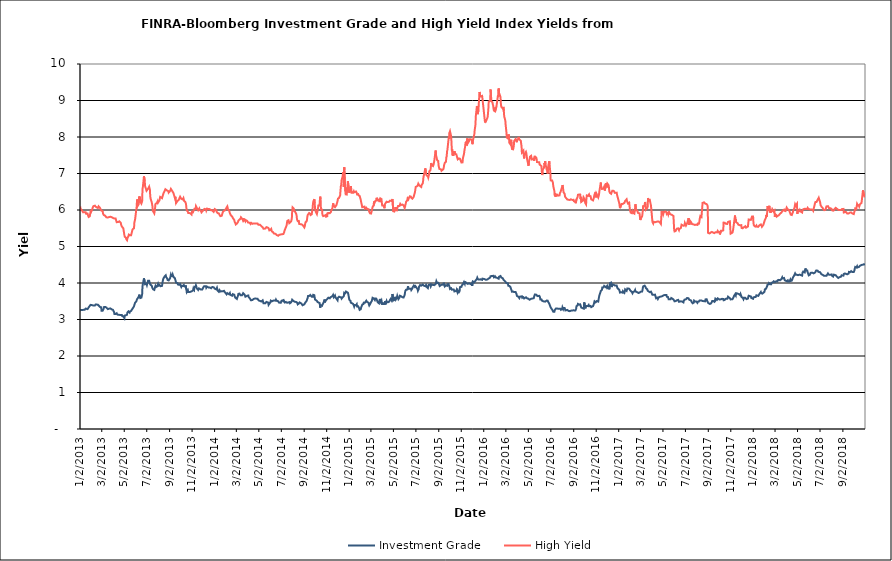
| Category | Investment Grade | High Yield |
|---|---|---|
| 1/2/13 | 3.253 | 6.097 |
| 1/3/13 | 3.262 | 6.031 |
| 1/4/13 | 3.275 | 6.009 |
| 1/7/13 | 3.263 | 5.989 |
| 1/8/13 | 3.254 | 5.982 |
| 1/9/13 | 3.254 | 5.981 |
| 1/10/13 | 3.263 | 5.936 |
| 1/11/13 | 3.269 | 5.922 |
| 1/14/13 | 3.266 | 5.942 |
| 1/15/13 | 3.27 | 5.969 |
| 1/16/13 | 3.27 | 5.969 |
| 1/17/13 | 3.3 | 5.937 |
| 1/18/13 | 3.291 | 5.899 |
| 1/22/13 | 3.284 | 5.903 |
| 1/23/13 | 3.277 | 5.86 |
| 1/24/13 | 3.294 | 5.846 |
| 1/25/13 | 3.332 | 5.809 |
| 1/28/13 | 3.372 | 5.827 |
| 1/29/13 | 3.379 | 5.889 |
| 1/30/13 | 3.401 | 5.942 |
| 1/31/13 | 3.394 | 6.003 |
| 2/1/13 | 3.393 | 5.96 |
| 2/4/13 | 3.392 | 6.024 |
| 2/5/13 | 3.412 | 6.065 |
| 2/6/13 | 3.397 | 6.086 |
| 2/7/13 | 3.382 | 6.107 |
| 2/8/13 | 3.395 | 6.111 |
| 2/11/13 | 3.385 | 6.118 |
| 2/12/13 | 3.399 | 6.096 |
| 2/13/13 | 3.412 | 6.09 |
| 2/14/13 | 3.398 | 6.075 |
| 2/15/13 | 3.402 | 6.08 |
| 2/19/13 | 3.405 | 6.055 |
| 2/20/13 | 3.406 | 6.039 |
| 2/21/13 | 3.382 | 6.101 |
| 2/22/13 | 3.373 | 6.085 |
| 2/25/13 | 3.342 | 6.054 |
| 2/26/13 | 3.328 | 6.07 |
| 2/27/13 | 3.332 | 6.052 |
| 2/28/13 | 3.335 | 5.988 |
| 3/1/13 | 3.239 | 5.98 |
| 3/4/13 | 3.242 | 5.966 |
| 3/5/13 | 3.255 | 5.902 |
| 3/6/13 | 3.279 | 5.894 |
| 3/7/13 | 3.308 | 5.863 |
| 3/8/13 | 3.345 | 5.861 |
| 3/11/13 | 3.345 | 5.841 |
| 3/12/13 | 3.32 | 5.826 |
| 3/13/13 | 3.327 | 5.822 |
| 3/14/13 | 3.328 | 5.799 |
| 3/15/13 | 3.305 | 5.794 |
| 3/18/13 | 3.284 | 5.795 |
| 3/19/13 | 3.26 | 5.788 |
| 3/20/13 | 3.291 | 5.81 |
| 3/21/13 | 3.296 | 5.805 |
| 3/22/13 | 3.302 | 5.8 |
| 3/25/13 | 3.303 | 5.814 |
| 3/26/13 | 3.312 | 5.815 |
| 3/27/13 | 3.283 | 5.806 |
| 3/28/13 | 3.28 | 5.806 |
| 4/1/13 | 3.264 | 5.782 |
| 4/2/13 | 3.274 | 5.776 |
| 4/3/13 | 3.242 | 5.781 |
| 4/4/13 | 3.202 | 5.769 |
| 4/5/13 | 3.149 | 5.775 |
| 4/8/13 | 3.151 | 5.769 |
| 4/9/13 | 3.146 | 5.733 |
| 4/10/13 | 3.17 | 5.712 |
| 4/11/13 | 3.172 | 5.667 |
| 4/12/13 | 3.142 | 5.651 |
| 4/15/13 | 3.128 | 5.669 |
| 4/16/13 | 3.134 | 5.653 |
| 4/17/13 | 3.128 | 5.675 |
| 4/18/13 | 3.127 | 5.689 |
| 4/19/13 | 3.135 | 5.67 |
| 4/22/13 | 3.126 | 5.653 |
| 4/23/13 | 3.117 | 5.6 |
| 4/24/13 | 3.105 | 5.569 |
| 4/25/13 | 3.125 | 5.572 |
| 4/26/13 | 3.092 | 5.534 |
| 4/29/13 | 3.087 | 5.499 |
| 4/30/13 | 3.086 | 5.43 |
| 5/1/13 | 3.067 | 5.368 |
| 5/2/13 | 3.036 | 5.305 |
| 5/3/13 | 3.109 | 5.266 |
| 5/6/13 | 3.117 | 5.244 |
| 5/7/13 | 3.136 | 5.201 |
| 5/8/13 | 3.129 | 5.184 |
| 5/9/13 | 3.131 | 5.173 |
| 5/10/13 | 3.19 | 5.221 |
| 5/13/13 | 3.224 | 5.288 |
| 5/14/13 | 3.228 | 5.326 |
| 5/15/13 | 3.223 | 5.334 |
| 5/16/13 | 3.19 | 5.306 |
| 5/17/13 | 3.218 | 5.305 |
| 5/20/13 | 3.234 | 5.306 |
| 5/21/13 | 3.229 | 5.314 |
| 5/22/13 | 3.258 | 5.327 |
| 5/23/13 | 3.284 | 5.429 |
| 5/24/13 | 3.284 | 5.465 |
| 5/28/13 | 3.36 | 5.504 |
| 5/29/13 | 3.404 | 5.657 |
| 5/30/13 | 3.413 | 5.675 |
| 5/31/13 | 3.463 | 5.748 |
| 6/3/13 | 3.494 | 5.995 |
| 6/4/13 | 3.522 | 6.063 |
| 6/5/13 | 3.552 | 6.239 |
| 6/6/13 | 3.551 | 6.291 |
| 6/7/13 | 3.57 | 6.113 |
| 6/10/13 | 3.628 | 6.164 |
| 6/11/13 | 3.681 | 6.371 |
| 6/12/13 | 3.674 | 6.305 |
| 6/13/13 | 3.66 | 6.359 |
| 6/14/13 | 3.588 | 6.227 |
| 6/17/13 | 3.599 | 6.175 |
| 6/18/13 | 3.646 | 6.192 |
| 6/19/13 | 3.69 | 6.237 |
| 6/20/13 | 3.91 | 6.572 |
| 6/21/13 | 3.967 | 6.634 |
| 6/24/13 | 4.127 | 6.924 |
| 6/25/13 | 4.1 | 6.906 |
| 6/26/13 | 4.034 | 6.807 |
| 6/27/13 | 3.965 | 6.661 |
| 6/28/13 | 3.948 | 6.621 |
| 7/1/13 | 3.98 | 6.527 |
| 7/2/13 | 3.946 | 6.515 |
| 7/3/13 | 3.938 | 6.511 |
| 7/5/13 | 4.063 | 6.58 |
| 7/8/13 | 4.062 | 6.64 |
| 7/9/13 | 4.028 | 6.597 |
| 7/10/13 | 4.031 | 6.565 |
| 7/11/13 | 3.96 | 6.376 |
| 7/12/13 | 3.939 | 6.31 |
| 7/15/13 | 3.925 | 6.216 |
| 7/16/13 | 3.898 | 6.158 |
| 7/17/13 | 3.86 | 6.1 |
| 7/18/13 | 3.855 | 5.979 |
| 7/19/13 | 3.825 | 5.96 |
| 7/22/13 | 3.811 | 5.908 |
| 7/23/13 | 3.816 | 5.902 |
| 7/24/13 | 3.884 | 6.035 |
| 7/25/13 | 3.915 | 6.163 |
| 7/26/13 | 3.885 | 6.171 |
| 7/29/13 | 3.902 | 6.194 |
| 7/30/13 | 3.908 | 6.189 |
| 7/31/13 | 3.941 | 6.239 |
| 8/1/13 | 3.969 | 6.199 |
| 8/2/13 | 3.925 | 6.226 |
| 8/5/13 | 3.944 | 6.265 |
| 8/6/13 | 3.953 | 6.313 |
| 8/7/13 | 3.934 | 6.358 |
| 8/8/13 | 3.913 | 6.344 |
| 8/9/13 | 3.916 | 6.347 |
| 8/12/13 | 3.923 | 6.324 |
| 8/13/13 | 4.006 | 6.362 |
| 8/14/13 | 4.018 | 6.359 |
| 8/15/13 | 4.099 | 6.426 |
| 8/16/13 | 4.129 | 6.46 |
| 8/19/13 | 4.18 | 6.522 |
| 8/20/13 | 4.155 | 6.544 |
| 8/21/13 | 4.183 | 6.569 |
| 8/22/13 | 4.211 | 6.583 |
| 8/23/13 | 4.166 | 6.552 |
| 8/26/13 | 4.123 | 6.531 |
| 8/27/13 | 4.082 | 6.547 |
| 8/28/13 | 4.096 | 6.551 |
| 8/29/13 | 4.092 | 6.517 |
| 8/30/13 | 4.071 | 6.478 |
| 9/3/13 | 4.136 | 6.523 |
| 9/4/13 | 4.142 | 6.53 |
| 9/5/13 | 4.228 | 6.578 |
| 9/6/13 | 4.2 | 6.565 |
| 9/9/13 | 4.187 | 6.515 |
| 9/10/13 | 4.229 | 6.522 |
| 9/11/13 | 4.208 | 6.505 |
| 9/12/13 | 4.17 | 6.461 |
| 9/13/13 | 4.184 | 6.455 |
| 9/16/13 | 4.128 | 6.326 |
| 9/17/13 | 4.134 | 6.364 |
| 9/18/13 | 4.104 | 6.315 |
| 9/19/13 | 4.011 | 6.189 |
| 9/20/13 | 4.008 | 6.188 |
| 9/23/13 | 3.998 | 6.249 |
| 9/24/13 | 3.96 | 6.231 |
| 9/25/13 | 3.94 | 6.257 |
| 9/26/13 | 3.957 | 6.271 |
| 9/27/13 | 3.951 | 6.297 |
| 9/30/13 | 3.97 | 6.364 |
| 10/1/13 | 3.942 | 6.375 |
| 10/2/13 | 3.916 | 6.359 |
| 10/3/13 | 3.897 | 6.31 |
| 10/4/13 | 3.925 | 6.295 |
| 10/7/13 | 3.916 | 6.288 |
| 10/8/13 | 3.924 | 6.308 |
| 10/9/13 | 3.938 | 6.326 |
| 10/10/13 | 3.948 | 6.286 |
| 10/11/13 | 3.91 | 6.244 |
| 10/14/13 | 3.897 | 6.226 |
| 10/15/13 | 3.933 | 6.22 |
| 10/16/13 | 3.91 | 6.161 |
| 10/17/13 | 3.823 | 6.063 |
| 10/18/13 | 3.753 | 5.992 |
| 10/21/13 | 3.801 | 5.954 |
| 10/22/13 | 3.751 | 5.916 |
| 10/23/13 | 3.738 | 5.926 |
| 10/24/13 | 3.757 | 5.93 |
| 10/25/13 | 3.752 | 5.918 |
| 10/28/13 | 3.76 | 5.906 |
| 10/29/13 | 3.759 | 5.89 |
| 10/30/13 | 3.742 | 5.891 |
| 10/31/13 | 3.771 | 5.876 |
| 11/1/13 | 3.795 | 5.951 |
| 11/4/13 | 3.796 | 5.939 |
| 11/5/13 | 3.844 | 5.976 |
| 11/6/13 | 3.827 | 5.962 |
| 11/7/13 | 3.813 | 5.955 |
| 11/8/13 | 3.899 | 6.033 |
| 11/11/13 | 3.894 | 6.024 |
| 11/12/13 | 3.936 | 6.103 |
| 11/13/13 | 3.906 | 6.126 |
| 11/14/13 | 3.856 | 6.076 |
| 11/15/13 | 3.848 | 6.045 |
| 11/18/13 | 3.809 | 5.992 |
| 11/19/13 | 3.825 | 6.008 |
| 11/20/13 | 3.853 | 6.015 |
| 11/21/13 | 3.879 | 6.04 |
| 11/22/13 | 3.847 | 5.999 |
| 11/25/13 | 3.821 | 5.98 |
| 11/26/13 | 3.799 | 5.977 |
| 11/27/13 | 3.816 | 5.936 |
| 11/29/13 | 3.822 | 5.927 |
| 12/2/13 | 3.881 | 5.994 |
| 12/3/13 | 3.869 | 5.992 |
| 12/4/13 | 3.91 | 6.015 |
| 12/5/13 | 3.928 | 6.031 |
| 12/6/13 | 3.927 | 6.016 |
| 12/9/13 | 3.91 | 6.018 |
| 12/10/13 | 3.87 | 5.984 |
| 12/11/13 | 3.872 | 5.997 |
| 12/12/13 | 3.9 | 6.039 |
| 12/13/13 | 3.895 | 6.03 |
| 12/16/13 | 3.878 | 6.026 |
| 12/17/13 | 3.858 | 6.027 |
| 12/18/13 | 3.859 | 6.033 |
| 12/19/13 | 3.878 | 6.024 |
| 12/20/13 | 3.856 | 6.016 |
| 12/23/13 | 3.857 | 5.993 |
| 12/24/13 | 3.875 | 5.996 |
| 12/26/13 | 3.89 | 5.991 |
| 12/27/13 | 3.903 | 5.977 |
| 12/30/13 | 3.883 | 5.95 |
| 12/31/13 | 3.873 | 5.948 |
| 1/2/14 | 3.844 | 6.025 |
| 1/3/14 | 3.842 | 6.009 |
| 1/6/14 | 3.825 | 5.995 |
| 1/7/14 | 3.818 | 5.951 |
| 1/8/14 | 3.87 | 5.943 |
| 1/9/14 | 3.864 | 5.942 |
| 1/10/14 | 3.79 | 5.914 |
| 1/13/14 | 3.762 | 5.905 |
| 1/14/14 | 3.784 | 5.909 |
| 1/15/14 | 3.803 | 5.867 |
| 1/16/14 | 3.78 | 5.861 |
| 1/17/14 | 3.766 | 5.831 |
| 1/21/14 | 3.774 | 5.843 |
| 1/22/14 | 3.801 | 5.829 |
| 1/23/14 | 3.784 | 5.857 |
| 1/24/14 | 3.772 | 5.948 |
| 1/27/14 | 3.786 | 5.982 |
| 1/28/14 | 3.782 | 5.991 |
| 1/29/14 | 3.754 | 6.003 |
| 1/30/14 | 3.748 | 5.991 |
| 1/31/14 | 3.738 | 6.016 |
| 2/3/14 | 3.69 | 6.066 |
| 2/4/14 | 3.699 | 6.082 |
| 2/5/14 | 3.722 | 6.098 |
| 2/6/14 | 3.728 | 6.079 |
| 2/7/14 | 3.695 | 6.015 |
| 2/10/14 | 3.691 | 5.986 |
| 2/11/14 | 3.713 | 5.962 |
| 2/12/14 | 3.724 | 5.911 |
| 2/13/14 | 3.68 | 5.9 |
| 2/14/14 | 3.672 | 5.865 |
| 2/18/14 | 3.652 | 5.821 |
| 2/19/14 | 3.651 | 5.805 |
| 2/20/14 | 3.695 | 5.797 |
| 2/21/14 | 3.681 | 5.767 |
| 2/24/14 | 3.677 | 5.721 |
| 2/25/14 | 3.637 | 5.673 |
| 2/26/14 | 3.618 | 5.653 |
| 2/27/14 | 3.595 | 5.636 |
| 2/28/14 | 3.598 | 5.604 |
| 3/3/14 | 3.563 | 5.628 |
| 3/4/14 | 3.601 | 5.616 |
| 3/5/14 | 3.613 | 5.618 |
| 3/6/14 | 3.649 | 5.671 |
| 3/7/14 | 3.701 | 5.709 |
| 3/10/14 | 3.709 | 5.736 |
| 3/11/14 | 3.709 | 5.734 |
| 3/12/14 | 3.691 | 5.747 |
| 3/13/14 | 3.664 | 5.765 |
| 3/14/14 | 3.655 | 5.799 |
| 3/17/14 | 3.663 | 5.765 |
| 3/18/14 | 3.661 | 5.749 |
| 3/19/14 | 3.675 | 5.728 |
| 3/20/14 | 3.72 | 5.777 |
| 3/21/14 | 3.695 | 5.705 |
| 3/24/14 | 3.678 | 5.735 |
| 3/25/14 | 3.669 | 5.735 |
| 3/26/14 | 3.626 | 5.694 |
| 3/27/14 | 3.629 | 5.724 |
| 3/28/14 | 3.647 | 5.698 |
| 3/31/14 | 3.652 | 5.7 |
| 4/1/14 | 3.641 | 5.714 |
| 4/2/14 | 3.676 | 5.658 |
| 4/3/14 | 3.658 | 5.653 |
| 4/4/14 | 3.612 | 5.634 |
| 4/7/14 | 3.582 | 5.65 |
| 4/8/14 | 3.577 | 5.642 |
| 4/9/14 | 3.572 | 5.618 |
| 4/10/14 | 3.527 | 5.604 |
| 4/11/14 | 3.519 | 5.647 |
| 4/14/14 | 3.533 | 5.622 |
| 4/15/14 | 3.529 | 5.639 |
| 4/16/14 | 3.534 | 5.633 |
| 4/17/14 | 3.562 | 5.633 |
| 4/21/14 | 3.574 | 5.631 |
| 4/22/14 | 3.588 | 5.628 |
| 4/23/14 | 3.564 | 5.628 |
| 4/24/14 | 3.572 | 5.628 |
| 4/25/14 | 3.554 | 5.625 |
| 4/28/14 | 3.568 | 5.63 |
| 4/29/14 | 3.582 | 5.617 |
| 4/30/14 | 3.551 | 5.598 |
| 5/1/14 | 3.522 | 5.612 |
| 5/2/14 | 3.506 | 5.584 |
| 5/5/14 | 3.507 | 5.594 |
| 5/6/14 | 3.51 | 5.583 |
| 5/7/14 | 3.506 | 5.579 |
| 5/8/14 | 3.493 | 5.562 |
| 5/9/14 | 3.498 | 5.534 |
| 5/12/14 | 3.526 | 5.525 |
| 5/13/14 | 3.501 | 5.514 |
| 5/14/14 | 3.446 | 5.488 |
| 5/15/14 | 3.426 | 5.499 |
| 5/16/14 | 3.439 | 5.512 |
| 5/19/14 | 3.443 | 5.491 |
| 5/20/14 | 3.448 | 5.508 |
| 5/21/14 | 3.47 | 5.5 |
| 5/22/14 | 3.482 | 5.53 |
| 5/23/14 | 3.463 | 5.526 |
| 5/27/14 | 3.462 | 5.512 |
| 5/28/14 | 3.401 | 5.487 |
| 5/29/14 | 3.398 | 5.479 |
| 5/30/14 | 3.421 | 5.443 |
| 6/2/14 | 3.475 | 5.453 |
| 6/3/14 | 3.517 | 5.48 |
| 6/4/14 | 3.528 | 5.481 |
| 6/5/14 | 3.519 | 5.441 |
| 6/6/14 | 3.499 | 5.411 |
| 6/9/14 | 3.513 | 5.394 |
| 6/10/14 | 3.532 | 5.381 |
| 6/11/14 | 3.523 | 5.359 |
| 6/12/14 | 3.523 | 5.362 |
| 6/13/14 | 3.519 | 5.366 |
| 6/16/14 | 3.516 | 5.346 |
| 6/17/14 | 3.546 | 5.364 |
| 6/18/14 | 3.533 | 5.363 |
| 6/19/14 | 3.511 | 5.314 |
| 6/20/14 | 3.523 | 5.304 |
| 6/23/14 | 3.501 | 5.294 |
| 6/24/14 | 3.494 | 5.293 |
| 6/25/14 | 3.465 | 5.304 |
| 6/26/14 | 3.453 | 5.321 |
| 6/27/14 | 3.457 | 5.324 |
| 6/30/14 | 3.458 | 5.329 |
| 7/1/14 | 3.475 | 5.317 |
| 7/2/14 | 3.514 | 5.332 |
| 7/3/14 | 3.538 | 5.336 |
| 7/7/14 | 3.53 | 5.343 |
| 7/8/14 | 3.473 | 5.364 |
| 7/9/14 | 3.502 | 5.384 |
| 7/10/14 | 3.481 | 5.427 |
| 7/11/14 | 3.466 | 5.431 |
| 7/14/14 | 3.482 | 5.531 |
| 7/15/14 | 3.497 | 5.553 |
| 7/16/14 | 3.49 | 5.582 |
| 7/17/14 | 3.459 | 5.665 |
| 7/18/14 | 3.469 | 5.704 |
| 7/21/14 | 3.467 | 5.719 |
| 7/22/14 | 3.458 | 5.682 |
| 7/23/14 | 3.443 | 5.641 |
| 7/24/14 | 3.478 | 5.654 |
| 7/25/14 | 3.446 | 5.658 |
| 7/28/14 | 3.469 | 5.688 |
| 7/29/14 | 3.455 | 5.7 |
| 7/30/14 | 3.506 | 5.764 |
| 7/31/14 | 3.543 | 5.968 |
| 8/1/14 | 3.525 | 6.073 |
| 8/4/14 | 3.505 | 6.045 |
| 8/5/14 | 3.517 | 5.981 |
| 8/6/14 | 3.51 | 5.994 |
| 8/7/14 | 3.485 | 5.965 |
| 8/8/14 | 3.464 | 5.953 |
| 8/11/14 | 3.48 | 5.889 |
| 8/12/14 | 3.494 | 5.843 |
| 8/13/14 | 3.476 | 5.746 |
| 8/14/14 | 3.454 | 5.721 |
| 8/15/14 | 3.415 | 5.695 |
| 8/18/14 | 3.436 | 5.699 |
| 8/19/14 | 3.443 | 5.618 |
| 8/20/14 | 3.467 | 5.635 |
| 8/21/14 | 3.456 | 5.605 |
| 8/22/14 | 3.449 | 5.612 |
| 8/25/14 | 3.437 | 5.607 |
| 8/26/14 | 3.427 | 5.585 |
| 8/27/14 | 3.422 | 5.589 |
| 8/28/14 | 3.39 | 5.591 |
| 8/29/14 | 3.388 | 5.58 |
| 9/2/14 | 3.417 | 5.521 |
| 9/3/14 | 3.422 | 5.55 |
| 9/4/14 | 3.455 | 5.611 |
| 9/5/14 | 3.442 | 5.659 |
| 9/8/14 | 3.508 | 5.69 |
| 9/9/14 | 3.502 | 5.725 |
| 9/10/14 | 3.526 | 5.811 |
| 9/11/14 | 3.592 | 5.863 |
| 9/12/14 | 3.644 | 5.879 |
| 9/15/14 | 3.645 | 5.918 |
| 9/16/14 | 3.638 | 5.941 |
| 9/17/14 | 3.642 | 5.916 |
| 9/18/14 | 3.672 | 5.895 |
| 9/19/14 | 3.648 | 5.863 |
| 9/22/14 | 3.624 | 5.882 |
| 9/23/14 | 3.611 | 5.959 |
| 9/24/14 | 3.634 | 6.004 |
| 9/25/14 | 3.622 | 6.133 |
| 9/26/14 | 3.675 | 6.226 |
| 9/29/14 | 3.665 | 6.297 |
| 9/30/14 | 3.666 | 6.198 |
| 10/1/14 | 3.546 | 6.041 |
| 10/2/14 | 3.543 | 6.033 |
| 10/3/14 | 3.562 | 5.951 |
| 10/6/14 | 3.511 | 5.891 |
| 10/7/14 | 3.49 | 5.942 |
| 10/8/14 | 3.476 | 5.966 |
| 10/9/14 | 3.455 | 6.047 |
| 10/10/14 | 3.455 | 6.125 |
| 10/13/14 | 3.455 | 6.126 |
| 10/14/14 | 3.415 | 6.254 |
| 10/15/14 | 3.322 | 6.366 |
| 10/16/14 | 3.392 | 6.295 |
| 10/17/14 | 3.405 | 6.024 |
| 10/20/14 | 3.378 | 6.011 |
| 10/21/14 | 3.408 | 5.869 |
| 10/22/14 | 3.423 | 5.856 |
| 10/23/14 | 3.438 | 5.833 |
| 10/24/14 | 3.46 | 5.826 |
| 10/27/14 | 3.549 | 5.844 |
| 10/28/14 | 3.47 | 5.831 |
| 10/29/14 | 3.508 | 5.854 |
| 10/30/14 | 3.484 | 5.863 |
| 10/31/14 | 3.523 | 5.818 |
| 11/3/14 | 3.563 | 5.828 |
| 11/4/14 | 3.561 | 5.914 |
| 11/5/14 | 3.58 | 5.896 |
| 11/6/14 | 3.597 | 5.904 |
| 11/7/14 | 3.571 | 5.919 |
| 11/10/14 | 3.581 | 5.911 |
| 11/11/14 | 3.58 | 5.894 |
| 11/12/14 | 3.61 | 5.917 |
| 11/13/14 | 3.63 | 5.944 |
| 11/14/14 | 3.622 | 5.986 |
| 11/17/14 | 3.639 | 6.05 |
| 11/18/14 | 3.664 | 6.114 |
| 11/19/14 | 3.676 | 6.183 |
| 11/20/14 | 3.645 | 6.193 |
| 11/21/14 | 3.61 | 6.102 |
| 11/24/14 | 3.655 | 6.077 |
| 11/25/14 | 3.614 | 6.062 |
| 11/26/14 | 3.592 | 6.055 |
| 11/28/14 | 3.571 | 6.136 |
| 12/1/14 | 3.527 | 6.244 |
| 12/2/14 | 3.592 | 6.31 |
| 12/3/14 | 3.6 | 6.3 |
| 12/4/14 | 3.583 | 6.311 |
| 12/5/14 | 3.624 | 6.33 |
| 12/8/14 | 3.613 | 6.401 |
| 12/9/14 | 3.596 | 6.533 |
| 12/10/14 | 3.594 | 6.652 |
| 12/11/14 | 3.607 | 6.697 |
| 12/12/14 | 3.574 | 6.816 |
| 12/15/14 | 3.61 | 6.93 |
| 12/16/14 | 3.622 | 7.031 |
| 12/17/14 | 3.611 | 6.874 |
| 12/18/14 | 3.64 | 6.631 |
| 12/19/14 | 3.733 | 7.172 |
| 12/22/14 | 3.718 | 6.524 |
| 12/23/14 | 3.739 | 6.429 |
| 12/24/14 | 3.766 | 6.426 |
| 12/26/14 | 3.758 | 6.424 |
| 12/29/14 | 3.733 | 6.787 |
| 12/30/14 | 3.701 | 6.803 |
| 12/31/14 | 3.703 | 6.802 |
| 1/2/15 | 3.539 | 6.473 |
| 1/5/15 | 3.512 | 6.579 |
| 1/6/15 | 3.46 | 6.653 |
| 1/7/15 | 3.461 | 6.584 |
| 1/8/15 | 3.475 | 6.473 |
| 1/9/15 | 3.446 | 6.454 |
| 1/12/15 | 3.428 | 6.47 |
| 1/13/15 | 3.418 | 6.483 |
| 1/14/15 | 3.39 | 6.514 |
| 1/15/15 | 3.36 | 6.485 |
| 1/16/15 | 3.398 | 6.499 |
| 1/20/15 | 3.388 | 6.507 |
| 1/21/15 | 3.406 | 6.501 |
| 1/22/15 | 3.418 | 6.465 |
| 1/23/15 | 3.358 | 6.428 |
| 1/26/15 | 3.361 | 6.434 |
| 1/27/15 | 3.345 | 6.403 |
| 1/28/15 | 3.321 | 6.38 |
| 1/29/15 | 3.327 | 6.384 |
| 1/30/15 | 3.263 | 6.383 |
| 2/2/15 | 3.283 | 6.276 |
| 2/3/15 | 3.33 | 6.218 |
| 2/4/15 | 3.356 | 6.175 |
| 2/5/15 | 3.339 | 6.128 |
| 2/6/15 | 3.407 | 6.077 |
| 2/9/15 | 3.421 | 6.086 |
| 2/10/15 | 3.462 | 6.091 |
| 2/11/15 | 3.47 | 6.106 |
| 2/12/15 | 3.453 | 6.094 |
| 2/13/15 | 3.458 | 6.04 |
| 2/17/15 | 3.516 | 6.061 |
| 2/18/15 | 3.496 | 6.032 |
| 2/19/15 | 3.481 | 6.045 |
| 2/20/15 | 3.471 | 6.044 |
| 2/23/15 | 3.46 | 6.021 |
| 2/24/15 | 3.413 | 5.985 |
| 2/25/15 | 3.385 | 5.95 |
| 2/26/15 | 3.409 | 5.923 |
| 2/27/15 | 3.418 | 5.91 |
| 3/2/15 | 3.477 | 5.903 |
| 3/3/15 | 3.496 | 5.943 |
| 3/4/15 | 3.51 | 5.991 |
| 3/5/15 | 3.501 | 6 |
| 3/6/15 | 3.594 | 6.079 |
| 3/9/15 | 3.577 | 6.134 |
| 3/10/15 | 3.55 | 6.235 |
| 3/11/15 | 3.562 | 6.188 |
| 3/12/15 | 3.536 | 6.163 |
| 3/13/15 | 3.575 | 6.241 |
| 3/16/15 | 3.572 | 6.268 |
| 3/17/15 | 3.575 | 6.335 |
| 3/18/15 | 3.525 | 6.323 |
| 3/19/15 | 3.502 | 6.265 |
| 3/20/15 | 3.473 | 6.273 |
| 3/23/15 | 3.447 | 6.285 |
| 3/24/15 | 3.422 | 6.276 |
| 3/25/15 | 3.437 | 6.217 |
| 3/26/15 | 3.564 | 6.235 |
| 3/27/15 | 3.474 | 6.318 |
| 3/30/15 | 3.526 | 6.299 |
| 3/31/15 | 3.507 | 6.274 |
| 4/1/15 | 3.404 | 6.124 |
| 4/2/15 | 3.449 | 6.142 |
| 4/6/15 | 3.44 | 6.113 |
| 4/7/15 | 3.404 | 6.048 |
| 4/8/15 | 3.398 | 6.153 |
| 4/9/15 | 3.501 | 6.166 |
| 4/10/15 | 3.417 | 6.184 |
| 4/13/15 | 3.504 | 6.228 |
| 4/14/15 | 3.471 | 6.226 |
| 4/15/15 | 3.473 | 6.219 |
| 4/16/15 | 3.484 | 6.218 |
| 4/17/15 | 3.473 | 6.234 |
| 4/20/15 | 3.489 | 6.228 |
| 4/21/15 | 3.492 | 6.234 |
| 4/22/15 | 3.533 | 6.256 |
| 4/23/15 | 3.533 | 6.264 |
| 4/24/15 | 3.564 | 6.251 |
| 4/27/15 | 3.515 | 6.246 |
| 4/28/15 | 3.552 | 6.264 |
| 4/29/15 | 3.699 | 6.302 |
| 4/30/15 | 3.726 | 6.285 |
| 5/1/15 | 3.52 | 5.968 |
| 5/4/15 | 3.534 | 5.958 |
| 5/5/15 | 3.574 | 5.972 |
| 5/6/15 | 3.62 | 6.006 |
| 5/7/15 | 3.605 | 6.081 |
| 5/8/15 | 3.55 | 5.995 |
| 5/11/15 | 3.609 | 5.99 |
| 5/12/15 | 3.65 | 6.054 |
| 5/13/15 | 3.637 | 6.048 |
| 5/14/15 | 3.622 | 6.108 |
| 5/15/15 | 3.557 | 6.102 |
| 5/18/15 | 3.6 | 6.112 |
| 5/19/15 | 3.651 | 6.136 |
| 5/20/15 | 3.661 | 6.167 |
| 5/21/15 | 3.638 | 6.158 |
| 5/22/15 | 3.64 | 6.136 |
| 5/26/15 | 3.609 | 6.149 |
| 5/27/15 | 3.605 | 6.158 |
| 5/28/15 | 3.609 | 6.154 |
| 5/29/15 | 3.603 | 6.129 |
| 6/1/15 | 3.671 | 6.055 |
| 6/2/15 | 3.74 | 6.084 |
| 6/3/15 | 3.79 | 6.139 |
| 6/4/15 | 3.77 | 6.173 |
| 6/5/15 | 3.818 | 6.229 |
| 6/8/15 | 3.819 | 6.264 |
| 6/9/15 | 3.86 | 6.317 |
| 6/10/15 | 3.91 | 6.341 |
| 6/11/15 | 3.87 | 6.29 |
| 6/12/15 | 3.84 | 6.32 |
| 6/15/15 | 3.842 | 6.375 |
| 6/16/15 | 3.839 | 6.396 |
| 6/17/15 | 3.856 | 6.39 |
| 6/18/15 | 3.846 | 6.365 |
| 6/19/15 | 3.809 | 6.333 |
| 6/22/15 | 3.854 | 6.31 |
| 6/23/15 | 3.886 | 6.314 |
| 6/24/15 | 3.89 | 6.335 |
| 6/25/15 | 3.906 | 6.351 |
| 6/26/15 | 3.933 | 6.383 |
| 6/29/15 | 3.911 | 6.493 |
| 6/30/15 | 3.862 | 6.48 |
| 7/1/15 | 3.903 | 6.633 |
| 7/2/15 | 3.879 | 6.623 |
| 7/6/15 | 3.834 | 6.661 |
| 7/7/15 | 3.788 | 6.691 |
| 7/8/15 | 3.79 | 6.722 |
| 7/9/15 | 3.833 | 6.699 |
| 7/10/15 | 3.898 | 6.684 |
| 7/13/15 | 3.945 | 6.654 |
| 7/14/15 | 3.962 | 6.658 |
| 7/15/15 | 3.941 | 6.639 |
| 7/16/15 | 3.928 | 6.631 |
| 7/17/15 | 3.92 | 6.684 |
| 7/20/15 | 3.957 | 6.728 |
| 7/21/15 | 3.946 | 6.789 |
| 7/22/15 | 3.931 | 6.902 |
| 7/23/15 | 3.927 | 6.942 |
| 7/24/15 | 3.914 | 6.987 |
| 7/27/15 | 3.912 | 7.142 |
| 7/28/15 | 3.92 | 7.122 |
| 7/29/15 | 3.945 | 7.014 |
| 7/30/15 | 3.937 | 6.955 |
| 7/31/15 | 3.891 | 6.938 |
| 8/3/15 | 3.859 | 6.92 |
| 8/4/15 | 3.885 | 6.888 |
| 8/5/15 | 3.946 | 6.932 |
| 8/6/15 | 3.943 | 6.967 |
| 8/7/15 | 3.927 | 7.062 |
| 8/10/15 | 3.964 | 7.093 |
| 8/11/15 | 3.914 | 7.18 |
| 8/12/15 | 3.922 | 7.288 |
| 8/13/15 | 3.961 | 7.23 |
| 8/14/15 | 3.966 | 7.205 |
| 8/17/15 | 3.946 | 7.205 |
| 8/18/15 | 3.964 | 7.21 |
| 8/19/15 | 3.97 | 7.268 |
| 8/20/15 | 3.942 | 7.329 |
| 8/21/15 | 3.932 | 7.397 |
| 8/24/15 | 3.969 | 7.631 |
| 8/25/15 | 4.004 | 7.506 |
| 8/26/15 | 4.048 | 7.509 |
| 8/27/15 | 4.024 | 7.42 |
| 8/28/15 | 3.999 | 7.369 |
| 8/31/15 | 4.006 | 7.34 |
| 9/1/15 | 3.984 | 7.221 |
| 9/2/15 | 3.974 | 7.211 |
| 9/3/15 | 3.949 | 7.128 |
| 9/4/15 | 3.918 | 7.154 |
| 9/8/15 | 3.947 | 7.11 |
| 9/9/15 | 3.956 | 7.075 |
| 9/10/15 | 3.97 | 7.101 |
| 9/11/15 | 3.954 | 7.087 |
| 9/14/15 | 3.96 | 7.121 |
| 9/15/15 | 4.007 | 7.156 |
| 9/16/15 | 4.028 | 7.23 |
| 9/17/15 | 3.993 | 7.256 |
| 9/18/15 | 3.906 | 7.296 |
| 9/21/15 | 3.934 | 7.32 |
| 9/22/15 | 3.908 | 7.44 |
| 9/23/15 | 3.928 | 7.47 |
| 9/24/15 | 3.924 | 7.602 |
| 9/25/15 | 3.968 | 7.65 |
| 9/28/15 | 3.972 | 7.936 |
| 9/29/15 | 3.972 | 8.01 |
| 9/30/15 | 3.965 | 7.959 |
| 10/1/15 | 3.884 | 8.129 |
| 10/2/15 | 3.839 | 8.158 |
| 10/5/15 | 3.857 | 8.024 |
| 10/6/15 | 3.84 | 7.851 |
| 10/7/15 | 3.818 | 7.629 |
| 10/8/15 | 3.812 | 7.659 |
| 10/9/15 | 3.837 | 7.508 |
| 10/12/15 | 3.824 | 7.508 |
| 10/13/15 | 3.812 | 7.563 |
| 10/14/15 | 3.768 | 7.61 |
| 10/15/15 | 3.779 | 7.616 |
| 10/16/15 | 3.788 | 7.538 |
| 10/19/15 | 3.785 | 7.528 |
| 10/20/15 | 3.814 | 7.497 |
| 10/21/15 | 3.788 | 7.455 |
| 10/22/15 | 3.753 | 7.473 |
| 10/23/15 | 3.796 | 7.388 |
| 10/26/15 | 3.747 | 7.413 |
| 10/27/15 | 3.743 | 7.438 |
| 10/28/15 | 3.777 | 7.418 |
| 10/29/15 | 3.886 | 7.404 |
| 10/30/15 | 3.896 | 7.394 |
| 11/2/15 | 3.894 | 7.301 |
| 11/3/15 | 3.935 | 7.298 |
| 11/4/15 | 3.959 | 7.279 |
| 11/5/15 | 3.956 | 7.305 |
| 11/6/15 | 3.965 | 7.419 |
| 11/9/15 | 4.026 | 7.539 |
| 11/10/15 | 4.023 | 7.622 |
| 11/11/15 | 3.98 | 7.598 |
| 11/12/15 | 4.043 | 7.738 |
| 11/13/15 | 4.012 | 7.843 |
| 11/16/15 | 3.995 | 7.878 |
| 11/17/15 | 4.004 | 7.77 |
| 11/18/15 | 4.007 | 7.96 |
| 11/19/15 | 3.976 | 7.826 |
| 11/20/15 | 3.983 | 7.817 |
| 11/23/15 | 3.992 | 7.892 |
| 11/24/15 | 3.987 | 7.94 |
| 11/25/15 | 3.985 | 7.947 |
| 11/27/15 | 3.969 | 7.941 |
| 11/30/15 | 3.988 | 7.921 |
| 12/1/15 | 3.922 | 7.843 |
| 12/2/15 | 3.941 | 7.803 |
| 12/3/15 | 4.042 | 7.88 |
| 12/4/15 | 4.027 | 7.946 |
| 12/7/15 | 4.02 | 8.079 |
| 12/8/15 | 4.022 | 8.196 |
| 12/9/15 | 4.049 | 8.261 |
| 12/10/15 | 4.07 | 8.336 |
| 12/11/15 | 4.029 | 8.573 |
| 12/14/15 | 4.113 | 8.851 |
| 12/15/15 | 4.144 | 8.708 |
| 12/16/15 | 4.149 | 8.625 |
| 12/17/15 | 4.1 | 8.603 |
| 12/18/15 | 4.089 | 8.721 |
| 12/21/15 | 4.094 | 9.233 |
| 12/22/15 | 4.106 | 9.187 |
| 12/23/15 | 4.112 | 9.11 |
| 12/24/15 | 4.101 | 9.094 |
| 12/28/15 | 4.087 | 9.127 |
| 12/29/15 | 4.12 | 9.054 |
| 12/30/15 | 4.125 | 9.036 |
| 12/31/15 | 4.104 | 9.06 |
| 1/4/16 | 4.106 | 8.484 |
| 1/5/16 | 4.12 | 8.399 |
| 1/6/16 | 4.084 | 8.412 |
| 1/7/16 | 4.09 | 8.486 |
| 1/8/16 | 4.067 | 8.446 |
| 1/11/16 | 4.093 | 8.512 |
| 1/12/16 | 4.085 | 8.549 |
| 1/13/16 | 4.082 | 8.64 |
| 1/14/16 | 4.118 | 8.769 |
| 1/15/16 | 4.122 | 8.973 |
| 1/19/16 | 4.149 | 8.988 |
| 1/20/16 | 4.186 | 9.301 |
| 1/21/16 | 4.177 | 9.211 |
| 1/22/16 | 4.196 | 8.98 |
| 1/25/16 | 4.194 | 8.955 |
| 1/26/16 | 4.187 | 8.894 |
| 1/27/16 | 4.214 | 8.863 |
| 1/28/16 | 4.196 | 8.783 |
| 1/29/16 | 4.16 | 8.725 |
| 2/1/16 | 4.182 | 8.703 |
| 2/2/16 | 4.154 | 8.78 |
| 2/3/16 | 4.156 | 8.825 |
| 2/4/16 | 4.15 | 8.793 |
| 2/5/16 | 4.151 | 8.837 |
| 2/8/16 | 4.131 | 9.058 |
| 2/9/16 | 4.149 | 9.143 |
| 2/10/16 | 4.131 | 9.094 |
| 2/11/16 | 4.116 | 9.329 |
| 2/12/16 | 4.171 | 9.21 |
| 2/16/16 | 4.192 | 9.095 |
| 2/17/16 | 4.208 | 8.915 |
| 2/18/16 | 4.15 | 8.831 |
| 2/19/16 | 4.138 | 8.84 |
| 2/22/16 | 4.13 | 8.781 |
| 2/23/16 | 4.106 | 8.783 |
| 2/24/16 | 4.09 | 8.824 |
| 2/25/16 | 4.064 | 8.702 |
| 2/26/16 | 4.072 | 8.564 |
| 2/29/16 | 4.042 | 8.449 |
| 3/1/16 | 4.025 | 8.321 |
| 3/2/16 | 4.029 | 8.227 |
| 3/3/16 | 3.997 | 8.131 |
| 3/4/16 | 4.002 | 7.988 |
| 3/7/16 | 3.992 | 7.96 |
| 3/8/16 | 3.928 | 8.028 |
| 3/9/16 | 3.943 | 8.071 |
| 3/10/16 | 3.949 | 8.015 |
| 3/11/16 | 3.918 | 7.839 |
| 3/14/16 | 3.887 | 7.796 |
| 3/15/16 | 3.911 | 7.883 |
| 3/16/16 | 3.862 | 7.924 |
| 3/17/16 | 3.796 | 7.778 |
| 3/18/16 | 3.762 | 7.673 |
| 3/21/16 | 3.765 | 7.661 |
| 3/22/16 | 3.763 | 7.696 |
| 3/23/16 | 3.743 | 7.751 |
| 3/24/16 | 3.75 | 7.891 |
| 3/28/16 | 3.751 | 7.945 |
| 3/29/16 | 3.724 | 7.962 |
| 3/30/16 | 3.707 | 7.915 |
| 3/31/16 | 3.668 | 7.857 |
| 4/1/16 | 3.64 | 7.924 |
| 4/4/16 | 3.626 | 7.932 |
| 4/5/16 | 3.6 | 8.003 |
| 4/6/16 | 3.616 | 7.948 |
| 4/7/16 | 3.587 | 7.964 |
| 4/8/16 | 3.623 | 7.931 |
| 4/11/16 | 3.629 | 7.898 |
| 4/12/16 | 3.648 | 7.816 |
| 4/13/16 | 3.636 | 7.75 |
| 4/14/16 | 3.636 | 7.578 |
| 4/15/16 | 3.596 | 7.599 |
| 4/18/16 | 3.611 | 7.627 |
| 4/19/16 | 3.584 | 7.493 |
| 4/20/16 | 3.577 | 7.413 |
| 4/21/16 | 3.601 | 7.525 |
| 4/22/16 | 3.602 | 7.509 |
| 4/25/16 | 3.608 | 7.592 |
| 4/26/16 | 3.633 | 7.556 |
| 4/27/16 | 3.611 | 7.481 |
| 4/28/16 | 3.58 | 7.395 |
| 4/29/16 | 3.567 | 7.393 |
| 5/2/16 | 3.567 | 7.211 |
| 5/3/16 | 3.545 | 7.322 |
| 5/4/16 | 3.56 | 7.364 |
| 5/5/16 | 3.542 | 7.403 |
| 5/6/16 | 3.562 | 7.461 |
| 5/9/16 | 3.568 | 7.485 |
| 5/10/16 | 3.562 | 7.463 |
| 5/11/16 | 3.554 | 7.385 |
| 5/12/16 | 3.575 | 7.4 |
| 5/13/16 | 3.564 | 7.402 |
| 5/16/16 | 3.583 | 7.399 |
| 5/17/16 | 3.587 | 7.35 |
| 5/18/16 | 3.653 | 7.369 |
| 5/19/16 | 3.683 | 7.483 |
| 5/20/16 | 3.682 | 7.418 |
| 5/23/16 | 3.68 | 7.433 |
| 5/24/16 | 3.695 | 7.39 |
| 5/25/16 | 3.68 | 7.313 |
| 5/26/16 | 3.641 | 7.301 |
| 5/27/16 | 3.632 | 7.293 |
| 5/31/16 | 3.649 | 7.308 |
| 6/1/16 | 3.638 | 7.247 |
| 6/2/16 | 3.613 | 7.269 |
| 6/3/16 | 3.549 | 7.242 |
| 6/6/16 | 3.55 | 7.2 |
| 6/7/16 | 3.53 | 7.058 |
| 6/8/16 | 3.512 | 6.957 |
| 6/9/16 | 3.494 | 7.046 |
| 6/10/16 | 3.491 | 7.112 |
| 6/13/16 | 3.493 | 7.16 |
| 6/14/16 | 3.513 | 7.288 |
| 6/15/16 | 3.501 | 7.256 |
| 6/16/16 | 3.489 | 7.342 |
| 6/17/16 | 3.503 | 7.262 |
| 6/20/16 | 3.518 | 7.114 |
| 6/21/16 | 3.523 | 7.133 |
| 6/22/16 | 3.512 | 7.061 |
| 6/23/16 | 3.517 | 7 |
| 6/24/16 | 3.486 | 7.176 |
| 6/27/16 | 3.438 | 7.337 |
| 6/28/16 | 3.412 | 7.263 |
| 6/29/16 | 3.384 | 7.135 |
| 6/30/16 | 3.381 | 7.047 |
| 7/1/16 | 3.331 | 6.811 |
| 7/5/16 | 3.272 | 6.808 |
| 7/6/16 | 3.262 | 6.83 |
| 7/7/16 | 3.248 | 6.752 |
| 7/8/16 | 3.215 | 6.66 |
| 7/11/16 | 3.215 | 6.521 |
| 7/12/16 | 3.256 | 6.4 |
| 7/13/16 | 3.231 | 6.458 |
| 7/14/16 | 3.264 | 6.364 |
| 7/15/16 | 3.299 | 6.415 |
| 7/18/16 | 3.303 | 6.424 |
| 7/19/16 | 3.289 | 6.431 |
| 7/20/16 | 3.3 | 6.411 |
| 7/21/16 | 3.295 | 6.394 |
| 7/22/16 | 3.282 | 6.4 |
| 7/25/16 | 3.297 | 6.401 |
| 7/26/16 | 3.318 | 6.458 |
| 7/27/16 | 3.3 | 6.461 |
| 7/28/16 | 3.296 | 6.496 |
| 7/29/16 | 3.266 | 6.535 |
| 8/1/16 | 3.285 | 6.628 |
| 8/2/16 | 3.334 | 6.681 |
| 8/3/16 | 3.338 | 6.65 |
| 8/4/16 | 3.284 | 6.56 |
| 8/5/16 | 3.315 | 6.486 |
| 8/8/16 | 3.313 | 6.441 |
| 8/9/16 | 3.287 | 6.367 |
| 8/10/16 | 3.248 | 6.354 |
| 8/11/16 | 3.271 | 6.362 |
| 8/12/16 | 3.24 | 6.326 |
| 8/15/16 | 3.263 | 6.288 |
| 8/16/16 | 3.259 | 6.267 |
| 8/17/16 | 3.26 | 6.296 |
| 8/18/16 | 3.236 | 6.28 |
| 8/19/16 | 3.255 | 6.268 |
| 8/22/16 | 3.229 | 6.276 |
| 8/23/16 | 3.212 | 6.264 |
| 8/24/16 | 3.224 | 6.263 |
| 8/25/16 | 3.242 | 6.293 |
| 8/26/16 | 3.249 | 6.278 |
| 8/29/16 | 3.246 | 6.274 |
| 8/30/16 | 3.239 | 6.262 |
| 8/31/16 | 3.244 | 6.278 |
| 9/1/16 | 3.252 | 6.279 |
| 9/2/16 | 3.266 | 6.241 |
| 9/6/16 | 3.246 | 6.22 |
| 9/7/16 | 3.238 | 6.185 |
| 9/8/16 | 3.291 | 6.196 |
| 9/9/16 | 3.365 | 6.294 |
| 9/12/16 | 3.388 | 6.355 |
| 9/13/16 | 3.427 | 6.416 |
| 9/14/16 | 3.414 | 6.429 |
| 9/15/16 | 3.422 | 6.44 |
| 9/16/16 | 3.409 | 6.426 |
| 9/19/16 | 3.417 | 6.426 |
| 9/20/16 | 3.383 | 6.298 |
| 9/21/16 | 3.405 | 6.361 |
| 9/22/16 | 3.327 | 6.222 |
| 9/23/16 | 3.316 | 6.23 |
| 9/26/16 | 3.309 | 6.256 |
| 9/27/16 | 3.3 | 6.274 |
| 9/28/16 | 3.291 | 6.349 |
| 9/29/16 | 3.297 | 6.344 |
| 9/30/16 | 3.47 | 6.314 |
| 10/3/16 | 3.307 | 6.186 |
| 10/4/16 | 3.338 | 6.172 |
| 10/5/16 | 3.37 | 6.154 |
| 10/6/16 | 3.371 | 6.309 |
| 10/7/16 | 3.368 | 6.399 |
| 10/10/16 | 3.369 | 6.385 |
| 10/11/16 | 3.391 | 6.401 |
| 10/12/16 | 3.397 | 6.403 |
| 10/13/16 | 3.364 | 6.426 |
| 10/14/16 | 3.382 | 6.386 |
| 10/17/16 | 3.371 | 6.38 |
| 10/18/16 | 3.352 | 6.345 |
| 10/19/16 | 3.339 | 6.292 |
| 10/20/16 | 3.341 | 6.274 |
| 10/21/16 | 3.351 | 6.273 |
| 10/24/16 | 3.368 | 6.263 |
| 10/25/16 | 3.382 | 6.272 |
| 10/26/16 | 3.418 | 6.329 |
| 10/27/16 | 3.463 | 6.38 |
| 10/28/16 | 3.499 | 6.43 |
| 10/31/16 | 3.471 | 6.493 |
| 11/1/16 | 3.478 | 6.347 |
| 11/2/16 | 3.466 | 6.45 |
| 11/3/16 | 3.506 | 6.448 |
| 11/4/16 | 3.483 | 6.46 |
| 11/7/16 | 3.491 | 6.343 |
| 11/8/16 | 3.509 | 6.318 |
| 11/9/16 | 3.612 | 6.416 |
| 11/10/16 | 3.655 | 6.507 |
| 11/11/16 | 3.654 | 6.513 |
| 11/14/16 | 3.782 | 6.752 |
| 11/15/16 | 3.776 | 6.634 |
| 11/16/16 | 3.783 | 6.612 |
| 11/17/16 | 3.813 | 6.576 |
| 11/18/16 | 3.876 | 6.604 |
| 11/21/16 | 3.878 | 6.584 |
| 11/22/16 | 3.88 | 6.572 |
| 11/23/16 | 3.921 | 6.634 |
| 11/25/16 | 3.93 | 6.532 |
| 11/28/16 | 3.88 | 6.731 |
| 11/29/16 | 3.905 | 6.701 |
| 11/30/16 | 3.894 | 6.726 |
| 12/1/16 | 3.919 | 6.619 |
| 12/2/16 | 3.86 | 6.72 |
| 12/5/16 | 3.88 | 6.678 |
| 12/6/16 | 3.867 | 6.622 |
| 12/7/16 | 3.826 | 6.51 |
| 12/8/16 | 3.847 | 6.491 |
| 12/9/16 | 3.998 | 6.465 |
| 12/12/16 | 4.011 | 6.445 |
| 12/13/16 | 3.917 | 6.427 |
| 12/14/16 | 3.889 | 6.421 |
| 12/15/16 | 3.963 | 6.527 |
| 12/16/16 | 3.961 | 6.529 |
| 12/19/16 | 3.951 | 6.524 |
| 12/20/16 | 3.96 | 6.515 |
| 12/21/16 | 3.93 | 6.498 |
| 12/22/16 | 3.93 | 6.47 |
| 12/23/16 | 3.91 | 6.451 |
| 12/27/16 | 3.932 | 6.475 |
| 12/28/16 | 3.906 | 6.417 |
| 12/29/16 | 3.861 | 6.401 |
| 12/30/16 | 3.844 | 6.409 |
| 1/3/17 | 3.813 | 6.187 |
| 1/4/17 | 3.787 | 6.118 |
| 1/5/17 | 3.738 | 6.052 |
| 1/6/17 | 3.764 | 6.062 |
| 1/9/17 | 3.748 | 6.163 |
| 1/10/17 | 3.757 | 6.152 |
| 1/11/17 | 3.756 | 6.168 |
| 1/12/17 | 3.736 | 6.164 |
| 1/13/17 | 3.777 | 6.15 |
| 1/17/17 | 3.731 | 6.195 |
| 1/18/17 | 3.771 | 6.212 |
| 1/19/17 | 3.825 | 6.249 |
| 1/20/17 | 3.842 | 6.269 |
| 1/23/17 | 3.787 | 6.294 |
| 1/24/17 | 3.812 | 6.246 |
| 1/25/17 | 3.851 | 6.217 |
| 1/26/17 | 3.852 | 6.191 |
| 1/27/17 | 3.828 | 6.175 |
| 1/30/17 | 3.844 | 6.199 |
| 1/31/17 | 3.83 | 6.198 |
| 2/1/17 | 3.822 | 6 |
| 2/2/17 | 3.794 | 5.98 |
| 2/3/17 | 3.778 | 5.93 |
| 2/6/17 | 3.756 | 5.914 |
| 2/7/17 | 3.742 | 5.92 |
| 2/8/17 | 3.718 | 5.972 |
| 2/9/17 | 3.745 | 5.966 |
| 2/10/17 | 3.758 | 5.919 |
| 2/13/17 | 3.767 | 5.901 |
| 2/14/17 | 3.791 | 5.894 |
| 2/15/17 | 3.809 | 6.036 |
| 2/16/17 | 3.768 | 6.159 |
| 2/17/17 | 3.746 | 6.018 |
| 2/21/17 | 3.747 | 5.975 |
| 2/22/17 | 3.75 | 5.952 |
| 2/23/17 | 3.76 | 5.918 |
| 2/24/17 | 3.726 | 5.923 |
| 2/27/17 | 3.737 | 5.908 |
| 2/28/17 | 3.738 | 5.911 |
| 3/1/17 | 3.75 | 5.725 |
| 3/2/17 | 3.761 | 5.743 |
| 3/3/17 | 3.762 | 5.776 |
| 3/6/17 | 3.768 | 5.827 |
| 3/7/17 | 3.8 | 5.896 |
| 3/8/17 | 3.867 | 5.997 |
| 3/9/17 | 3.907 | 6.125 |
| 3/10/17 | 3.898 | 6.09 |
| 3/13/17 | 3.927 | 6.14 |
| 3/14/17 | 3.927 | 6.219 |
| 3/15/17 | 3.897 | 6.151 |
| 3/16/17 | 3.865 | 6.009 |
| 3/17/17 | 3.842 | 6.021 |
| 3/20/17 | 3.824 | 6.056 |
| 3/21/17 | 3.792 | 6.09 |
| 3/22/17 | 3.771 | 6.325 |
| 3/23/17 | 3.781 | 6.296 |
| 3/24/17 | 3.766 | 6.255 |
| 3/27/17 | 3.749 | 6.272 |
| 3/28/17 | 3.76 | 6.213 |
| 3/29/17 | 3.747 | 6.188 |
| 3/30/17 | 3.763 | 6.125 |
| 3/31/17 | 3.764 | 6.115 |
| 4/3/17 | 3.676 | 5.676 |
| 4/4/17 | 3.677 | 5.683 |
| 4/5/17 | 3.677 | 5.635 |
| 4/6/17 | 3.677 | 5.679 |
| 4/7/17 | 3.67 | 5.666 |
| 4/10/17 | 3.681 | 5.664 |
| 4/11/17 | 3.644 | 5.653 |
| 4/12/17 | 3.625 | 5.675 |
| 4/13/17 | 3.581 | 5.674 |
| 4/17/17 | 3.599 | 5.685 |
| 4/18/17 | 3.567 | 5.702 |
| 4/19/17 | 3.577 | 5.684 |
| 4/20/17 | 3.605 | 5.684 |
| 4/21/17 | 3.588 | 5.67 |
| 4/24/17 | 3.625 | 5.647 |
| 4/25/17 | 3.647 | 5.632 |
| 4/26/17 | 3.652 | 5.618 |
| 4/27/17 | 3.63 | 5.616 |
| 4/28/17 | 3.63 | 5.967 |
| 5/1/17 | 3.646 | 5.903 |
| 5/2/17 | 3.635 | 5.873 |
| 5/3/17 | 3.621 | 5.874 |
| 5/4/17 | 3.666 | 5.947 |
| 5/5/17 | 3.661 | 5.966 |
| 5/8/17 | 3.671 | 5.96 |
| 5/9/17 | 3.691 | 5.967 |
| 5/10/17 | 3.672 | 5.951 |
| 5/11/17 | 3.672 | 5.942 |
| 5/12/17 | 3.624 | 5.89 |
| 5/15/17 | 3.618 | 5.918 |
| 5/16/17 | 3.607 | 5.882 |
| 5/17/17 | 3.553 | 5.896 |
| 5/18/17 | 3.552 | 5.961 |
| 5/19/17 | 3.556 | 5.9 |
| 5/22/17 | 3.554 | 5.882 |
| 5/23/17 | 3.582 | 5.882 |
| 5/24/17 | 3.59 | 5.888 |
| 5/25/17 | 3.584 | 5.872 |
| 5/26/17 | 3.565 | 5.85 |
| 5/30/17 | 3.55 | 5.836 |
| 5/31/17 | 3.54 | 5.842 |
| 6/1/17 | 3.544 | 5.45 |
| 6/2/17 | 3.498 | 5.414 |
| 6/5/17 | 3.505 | 5.426 |
| 6/6/17 | 3.481 | 5.432 |
| 6/7/17 | 3.499 | 5.451 |
| 6/8/17 | 3.524 | 5.488 |
| 6/9/17 | 3.537 | 5.498 |
| 6/12/17 | 3.537 | 5.496 |
| 6/13/17 | 3.546 | 5.472 |
| 6/14/17 | 3.485 | 5.449 |
| 6/15/17 | 3.481 | 5.482 |
| 6/16/17 | 3.497 | 5.498 |
| 6/19/17 | 3.498 | 5.503 |
| 6/20/17 | 3.485 | 5.551 |
| 6/21/17 | 3.501 | 5.596 |
| 6/22/17 | 3.494 | 5.618 |
| 6/23/17 | 3.49 | 5.602 |
| 6/26/17 | 3.469 | 5.569 |
| 6/27/17 | 3.514 | 5.582 |
| 6/28/17 | 3.522 | 5.575 |
| 6/29/17 | 3.542 | 5.577 |
| 6/30/17 | 3.545 | 5.644 |
| 7/3/17 | 3.555 | 5.574 |
| 7/5/17 | 3.568 | 5.59 |
| 7/6/17 | 3.588 | 5.633 |
| 7/7/17 | 3.598 | 5.665 |
| 7/10/17 | 3.581 | 5.776 |
| 7/11/17 | 3.581 | 5.773 |
| 7/12/17 | 3.54 | 5.592 |
| 7/13/17 | 3.555 | 5.59 |
| 7/14/17 | 3.528 | 5.704 |
| 7/17/17 | 3.52 | 5.663 |
| 7/18/17 | 3.486 | 5.643 |
| 7/19/17 | 3.478 | 5.618 |
| 7/20/17 | 3.462 | 5.593 |
| 7/21/17 | 3.445 | 5.596 |
| 7/24/17 | 3.461 | 5.603 |
| 7/25/17 | 3.517 | 5.611 |
| 7/26/17 | 3.505 | 5.586 |
| 7/27/17 | 3.506 | 5.591 |
| 7/28/17 | 3.491 | 5.585 |
| 7/31/17 | 3.49 | 5.599 |
| 8/1/17 | 3.467 | 5.586 |
| 8/2/17 | 3.465 | 5.591 |
| 8/3/17 | 3.458 | 5.593 |
| 8/4/17 | 3.488 | 5.629 |
| 8/7/17 | 3.493 | 5.623 |
| 8/8/17 | 3.519 | 5.66 |
| 8/9/17 | 3.522 | 5.738 |
| 8/10/17 | 3.531 | 5.799 |
| 8/11/17 | 3.533 | 5.836 |
| 8/14/17 | 3.521 | 5.81 |
| 8/15/17 | 3.539 | 5.8 |
| 8/16/17 | 3.522 | 5.786 |
| 8/17/17 | 3.506 | 6.195 |
| 8/18/17 | 3.501 | 6.219 |
| 8/21/17 | 3.502 | 6.211 |
| 8/22/17 | 3.514 | 6.196 |
| 8/23/17 | 3.496 | 6.192 |
| 8/24/17 | 3.498 | 6.174 |
| 8/25/17 | 3.551 | 6.16 |
| 8/28/17 | 3.554 | 6.162 |
| 8/29/17 | 3.525 | 6.145 |
| 8/30/17 | 3.545 | 6.133 |
| 8/31/17 | 3.532 | 6.088 |
| 9/1/17 | 3.455 | 5.375 |
| 9/5/17 | 3.428 | 5.357 |
| 9/6/17 | 3.433 | 5.362 |
| 9/7/17 | 3.416 | 5.367 |
| 9/8/17 | 3.434 | 5.384 |
| 9/11/17 | 3.476 | 5.399 |
| 9/12/17 | 3.506 | 5.399 |
| 9/13/17 | 3.498 | 5.388 |
| 9/14/17 | 3.507 | 5.383 |
| 9/15/17 | 3.504 | 5.372 |
| 9/18/17 | 3.486 | 5.366 |
| 9/19/17 | 3.531 | 5.361 |
| 9/20/17 | 3.496 | 5.362 |
| 9/21/17 | 3.571 | 5.392 |
| 9/22/17 | 3.564 | 5.37 |
| 9/25/17 | 3.541 | 5.386 |
| 9/26/17 | 3.54 | 5.378 |
| 9/27/17 | 3.579 | 5.427 |
| 9/28/17 | 3.574 | 5.425 |
| 9/29/17 | 3.554 | 5.391 |
| 10/2/17 | 3.547 | 5.399 |
| 10/3/17 | 3.537 | 5.331 |
| 10/4/17 | 3.544 | 5.327 |
| 10/5/17 | 3.552 | 5.319 |
| 10/6/17 | 3.57 | 5.432 |
| 10/9/17 | 3.566 | 5.428 |
| 10/10/17 | 3.554 | 5.428 |
| 10/11/17 | 3.56 | 5.427 |
| 10/12/17 | 3.562 | 5.442 |
| 10/13/17 | 3.528 | 5.654 |
| 10/16/17 | 3.536 | 5.65 |
| 10/17/17 | 3.544 | 5.641 |
| 10/18/17 | 3.565 | 5.635 |
| 10/19/17 | 3.549 | 5.621 |
| 10/20/17 | 3.576 | 5.622 |
| 10/23/17 | 3.568 | 5.618 |
| 10/24/17 | 3.592 | 5.631 |
| 10/25/17 | 3.625 | 5.674 |
| 10/26/17 | 3.627 | 5.676 |
| 10/27/17 | 3.616 | 5.687 |
| 10/30/17 | 3.584 | 5.691 |
| 10/31/17 | 3.593 | 5.683 |
| 11/1/17 | 3.55 | 5.35 |
| 11/2/17 | 3.552 | 5.358 |
| 11/3/17 | 3.558 | 5.358 |
| 11/6/17 | 3.556 | 5.381 |
| 11/7/17 | 3.57 | 5.414 |
| 11/8/17 | 3.578 | 5.474 |
| 11/9/17 | 3.608 | 5.55 |
| 11/10/17 | 3.641 | 5.555 |
| 11/13/17 | 3.688 | 5.85 |
| 11/14/17 | 3.686 | 5.715 |
| 11/15/17 | 3.654 | 5.755 |
| 11/16/17 | 3.721 | 5.664 |
| 11/17/17 | 3.703 | 5.643 |
| 11/20/17 | 3.711 | 5.639 |
| 11/21/17 | 3.69 | 5.614 |
| 11/22/17 | 3.725 | 5.598 |
| 11/24/17 | 3.693 | 5.571 |
| 11/27/17 | 3.667 | 5.578 |
| 11/28/17 | 3.696 | 5.578 |
| 11/29/17 | 3.689 | 5.578 |
| 11/30/17 | 3.702 | 5.586 |
| 12/1/17 | 3.611 | 5.504 |
| 12/4/17 | 3.598 | 5.502 |
| 12/5/17 | 3.581 | 5.494 |
| 12/6/17 | 3.553 | 5.5 |
| 12/7/17 | 3.573 | 5.527 |
| 12/8/17 | 3.597 | 5.534 |
| 12/11/17 | 3.594 | 5.555 |
| 12/12/17 | 3.61 | 5.533 |
| 12/13/17 | 3.583 | 5.517 |
| 12/14/17 | 3.56 | 5.525 |
| 12/15/17 | 3.554 | 5.531 |
| 12/18/17 | 3.572 | 5.548 |
| 12/19/17 | 3.621 | 5.562 |
| 12/20/17 | 3.652 | 5.74 |
| 12/21/17 | 3.643 | 5.738 |
| 12/22/17 | 3.643 | 5.751 |
| 12/26/17 | 3.632 | 5.728 |
| 12/27/17 | 3.59 | 5.736 |
| 12/28/17 | 3.576 | 5.709 |
| 12/29/17 | 3.568 | 5.822 |
| 1/1/18 | 3.568 | 5.822 |
| 1/2/18 | 3.606 | 5.641 |
| 1/3/18 | 3.599 | 5.586 |
| 1/4/18 | 3.614 | 5.576 |
| 1/5/18 | 3.614 | 5.558 |
| 1/8/18 | 3.618 | 5.544 |
| 1/9/18 | 3.643 | 5.532 |
| 1/10/18 | 3.663 | 5.574 |
| 1/11/18 | 3.64 | 5.546 |
| 1/12/18 | 3.646 | 5.539 |
| 1/15/18 | 3.646 | 5.539 |
| 1/16/18 | 3.627 | 5.532 |
| 1/17/18 | 3.661 | 5.552 |
| 1/18/18 | 3.696 | 5.579 |
| 1/19/18 | 3.718 | 5.604 |
| 1/22/18 | 3.753 | 5.604 |
| 1/23/18 | 3.722 | 5.599 |
| 1/24/18 | 3.737 | 5.569 |
| 1/25/18 | 3.708 | 5.541 |
| 1/26/18 | 3.709 | 5.549 |
| 1/29/18 | 3.733 | 5.597 |
| 1/30/18 | 3.759 | 5.635 |
| 1/31/18 | 3.752 | 5.615 |
| 2/1/18 | 3.763 | 5.647 |
| 2/2/18 | 3.826 | 5.729 |
| 2/5/18 | 3.841 | 5.791 |
| 2/6/18 | 3.837 | 5.868 |
| 2/7/18 | 3.852 | 5.817 |
| 2/8/18 | 3.913 | 5.914 |
| 2/9/18 | 3.954 | 6.108 |
| 2/12/18 | 3.965 | 6.033 |
| 2/13/18 | 3.997 | 6.068 |
| 2/14/18 | 4.022 | 6.115 |
| 2/15/18 | 3.994 | 6.024 |
| 2/16/18 | 3.968 | 5.947 |
| 2/19/18 | 3.968 | 5.947 |
| 2/20/18 | 4.007 | 5.966 |
| 2/21/18 | 4.021 | 5.989 |
| 2/22/18 | 4.031 | 6.022 |
| 2/23/18 | 4.012 | 6.004 |
| 2/26/18 | 4.047 | 5.95 |
| 2/27/18 | 4.026 | 5.968 |
| 2/28/18 | 4.056 | 5.979 |
| 3/1/18 | 4.024 | 5.814 |
| 3/2/18 | 4.048 | 5.884 |
| 3/5/18 | 4.048 | 5.861 |
| 3/6/18 | 4.035 | 5.819 |
| 3/7/18 | 4.044 | 5.834 |
| 3/8/18 | 4.042 | 5.836 |
| 3/9/18 | 4.076 | 5.839 |
| 3/12/18 | 4.085 | 5.859 |
| 3/13/18 | 4.079 | 5.86 |
| 3/14/18 | 4.06 | 5.878 |
| 3/15/18 | 4.074 | 5.897 |
| 3/16/18 | 4.073 | 5.906 |
| 3/19/18 | 4.111 | 5.932 |
| 3/20/18 | 4.125 | 5.953 |
| 3/21/18 | 4.154 | 5.958 |
| 3/22/18 | 4.127 | 5.981 |
| 3/23/18 | 4.144 | 6 |
| 3/26/18 | 4.138 | 6.008 |
| 3/27/18 | 4.102 | 5.98 |
| 3/28/18 | 4.074 | 5.993 |
| 3/29/18 | 4.052 | 5.97 |
| 3/30/18 | 4.052 | 5.97 |
| 4/2/18 | 4.048 | 6.067 |
| 4/3/18 | 4.062 | 6.069 |
| 4/4/18 | 4.064 | 6.076 |
| 4/5/18 | 4.073 | 6.018 |
| 4/6/18 | 4.041 | 6.006 |
| 4/9/18 | 4.039 | 5.997 |
| 4/10/18 | 4.049 | 5.953 |
| 4/11/18 | 4.031 | 5.932 |
| 4/12/18 | 4.094 | 5.904 |
| 4/13/18 | 4.056 | 5.874 |
| 4/16/18 | 4.066 | 5.863 |
| 4/17/18 | 4.058 | 5.869 |
| 4/18/18 | 4.081 | 5.877 |
| 4/19/18 | 4.148 | 5.942 |
| 4/20/18 | 4.174 | 5.99 |
| 4/23/18 | 4.216 | 6.045 |
| 4/24/18 | 4.216 | 6.072 |
| 4/25/18 | 4.264 | 6.157 |
| 4/26/18 | 4.247 | 6.132 |
| 4/27/18 | 4.226 | 6.118 |
| 4/30/18 | 4.224 | 6.169 |
| 5/1/18 | 4.222 | 5.895 |
| 5/2/18 | 4.228 | 5.889 |
| 5/3/18 | 4.214 | 5.988 |
| 5/4/18 | 4.227 | 5.992 |
| 5/7/18 | 4.23 | 5.968 |
| 5/8/18 | 4.249 | 6 |
| 5/9/18 | 4.25 | 6.004 |
| 5/10/18 | 4.218 | 5.96 |
| 5/11/18 | 4.196 | 5.936 |
| 5/14/18 | 4.202 | 5.933 |
| 5/15/18 | 4.282 | 5.99 |
| 5/16/18 | 4.294 | 6.003 |
| 5/17/18 | 4.316 | 6.021 |
| 5/18/18 | 4.298 | 6.038 |
| 5/21/18 | 4.291 | 6.032 |
| 5/22/18 | 4.293 | 6.022 |
| 5/23/18 | 4.397 | 6.026 |
| 5/24/18 | 4.367 | 6.03 |
| 5/25/18 | 4.34 | 6.029 |
| 5/28/18 | 4.34 | 6.029 |
| 5/29/18 | 4.292 | 6.059 |
| 5/30/18 | 4.308 | 6.057 |
| 5/31/18 | 4.31 | 6.034 |
| 6/1/18 | 4.209 | 6.022 |
| 6/4/18 | 4.228 | 6.017 |
| 6/5/18 | 4.228 | 5.999 |
| 6/6/18 | 4.277 | 6.012 |
| 6/7/18 | 4.261 | 6.013 |
| 6/8/18 | 4.26 | 6.014 |
| 6/11/18 | 4.282 | 6.01 |
| 6/12/18 | 4.284 | 6.014 |
| 6/13/18 | 4.286 | 5.979 |
| 6/14/18 | 4.264 | 5.97 |
| 6/15/18 | 4.251 | 5.966 |
| 6/18/18 | 4.287 | 6.19 |
| 6/19/18 | 4.283 | 6.218 |
| 6/20/18 | 4.312 | 6.193 |
| 6/21/18 | 4.34 | 6.222 |
| 6/22/18 | 4.342 | 6.218 |
| 6/25/18 | 4.339 | 6.28 |
| 6/26/18 | 4.348 | 6.279 |
| 6/27/18 | 4.306 | 6.27 |
| 6/28/18 | 4.287 | 6.336 |
| 6/29/18 | 4.288 | 6.32 |
| 7/2/18 | 4.294 | 6.203 |
| 7/3/18 | 4.273 | 6.131 |
| 7/4/18 | 4.273 | 6.131 |
| 7/5/18 | 4.243 | 6.106 |
| 7/6/18 | 4.219 | 6.085 |
| 7/9/18 | 4.224 | 6.052 |
| 7/10/18 | 4.218 | 6.023 |
| 7/11/18 | 4.213 | 6.037 |
| 7/12/18 | 4.199 | 6.022 |
| 7/13/18 | 4.178 | 5.996 |
| 7/16/18 | 4.196 | 6.003 |
| 7/17/18 | 4.193 | 6.012 |
| 7/18/18 | 4.209 | 6.004 |
| 7/19/18 | 4.197 | 6.099 |
| 7/20/18 | 4.218 | 6.094 |
| 7/23/18 | 4.262 | 6.105 |
| 7/24/18 | 4.245 | 6.095 |
| 7/25/18 | 4.23 | 6.074 |
| 7/26/18 | 4.227 | 6.045 |
| 7/27/18 | 4.213 | 6.037 |
| 7/30/18 | 4.226 | 6.048 |
| 7/31/18 | 4.208 | 6.021 |
| 8/1/18 | 4.238 | 6.032 |
| 8/2/18 | 4.235 | 6.027 |
| 8/3/18 | 4.2 | 5.994 |
| 8/6/18 | 4.177 | 5.981 |
| 8/7/18 | 4.204 | 5.975 |
| 8/8/18 | 4.228 | 5.982 |
| 8/9/18 | 4.219 | 5.998 |
| 8/10/18 | 4.209 | 6.031 |
| 8/13/18 | 4.214 | 6.059 |
| 8/14/18 | 4.205 | 6.047 |
| 8/15/18 | 4.186 | 6.059 |
| 8/16/18 | 4.181 | 6.034 |
| 8/17/18 | 4.168 | 6.023 |
| 8/20/18 | 4.138 | 6.004 |
| 8/21/18 | 4.159 | 5.998 |
| 8/22/18 | 4.158 | 5.998 |
| 8/23/18 | 4.16 | 6 |
| 8/24/18 | 4.161 | 5.997 |
| 8/27/18 | 4.171 | 5.999 |
| 8/28/18 | 4.193 | 6 |
| 8/29/18 | 4.211 | 6.008 |
| 8/30/18 | 4.194 | 6.026 |
| 8/31/18 | 4.201 | 6.03 |
| 9/3/18 | 4.201 | 6.03 |
| 9/4/18 | 4.246 | 5.932 |
| 9/5/18 | 4.246 | 5.948 |
| 9/6/18 | 4.219 | 5.935 |
| 9/7/18 | 4.261 | 5.943 |
| 9/10/18 | 4.251 | 5.946 |
| 9/11/18 | 4.271 | 5.942 |
| 9/12/18 | 4.251 | 5.932 |
| 9/13/18 | 4.237 | 5.906 |
| 9/14/18 | 4.25 | 5.908 |
| 9/17/18 | 4.257 | 5.904 |
| 9/18/18 | 4.305 | 5.908 |
| 9/19/18 | 4.33 | 5.93 |
| 9/20/18 | 4.299 | 5.927 |
| 9/21/18 | 4.297 | 5.922 |
| 9/24/18 | 4.325 | 5.933 |
| 9/25/18 | 4.331 | 5.952 |
| 9/26/18 | 4.309 | 5.932 |
| 9/27/18 | 4.298 | 5.905 |
| 9/28/18 | 4.294 | 5.894 |
| 10/1/18 | 4.3 | 5.888 |
| 10/2/18 | 4.288 | 5.883 |
| 10/3/18 | 4.352 | 5.897 |
| 10/4/18 | 4.406 | 5.996 |
| 10/5/18 | 4.44 | 6.042 |
| 10/8/18 | 4.426 | 6.025 |
| 10/9/18 | 4.438 | 6.099 |
| 10/10/18 | 4.46 | 6.165 |
| 10/11/18 | 4.425 | 6.173 |
| 10/12/18 | 4.418 | 6.123 |
| 10/15/18 | 4.44 | 6.136 |
| 10/16/18 | 4.438 | 6.098 |
| 10/17/18 | 4.449 | 6.11 |
| 10/18/18 | 4.473 | 6.158 |
| 10/19/18 | 4.49 | 6.174 |
| 10/22/18 | 4.494 | 6.194 |
| 10/23/18 | 4.509 | 6.274 |
| 10/24/18 | 4.492 | 6.257 |
| 10/25/18 | 4.501 | 6.292 |
| 10/26/18 | 4.483 | 6.54 |
| 10/29/18 | 4.508 | 6.38 |
| 10/30/18 | 4.538 | 6.43 |
| 10/31/18 | 4.564 | 6.349 |